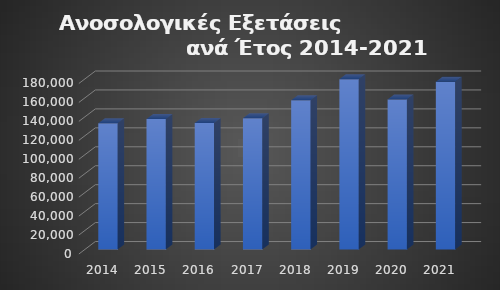
| Category | Ανοσολογικό  |
|---|---|
| 2014.0 | 133255 |
| 2015.0 | 137707 |
| 2016.0 | 133504 |
| 2017.0 | 138579 |
| 2018.0 | 157509 |
| 2019.0 | 179841 |
| 2020.0 | 158412 |
| 2021.0 | 177056 |